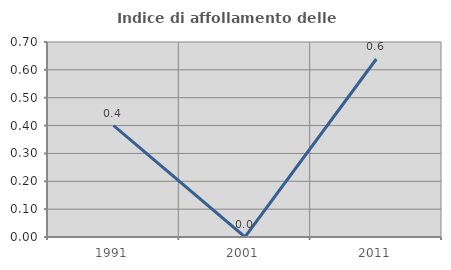
| Category | Indice di affollamento delle abitazioni  |
|---|---|
| 1991.0 | 0.4 |
| 2001.0 | 0 |
| 2011.0 | 0.639 |